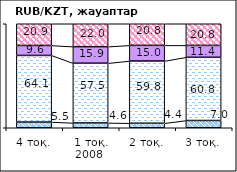
| Category | жоғарылайды | төмендейді | өзгермейді | білмеймін |
|---|---|---|---|---|
| 4 тоқ. | 5.48 | 64.06 | 9.59 | 20.87 |
| 1 тоқ. 2008  | 4.63 | 57.46 | 15.87 | 22.04 |
| 2 тоқ. | 4.35 | 59.84 | 15.02 | 20.79 |
| 3 тоқ. | 6.98 | 60.77 | 11.43 | 20.82 |